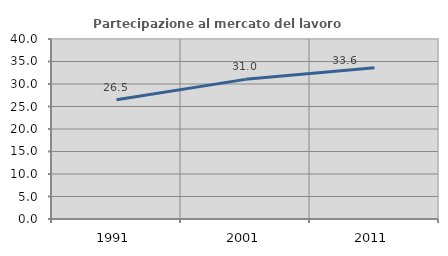
| Category | Partecipazione al mercato del lavoro  femminile |
|---|---|
| 1991.0 | 26.521 |
| 2001.0 | 31.029 |
| 2011.0 | 33.635 |